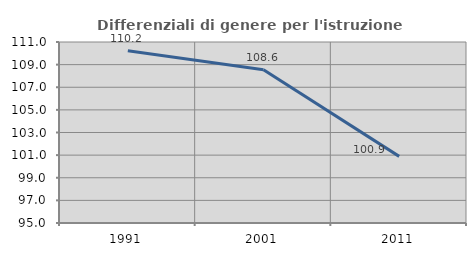
| Category | Differenziali di genere per l'istruzione superiore |
|---|---|
| 1991.0 | 110.222 |
| 2001.0 | 108.554 |
| 2011.0 | 100.889 |